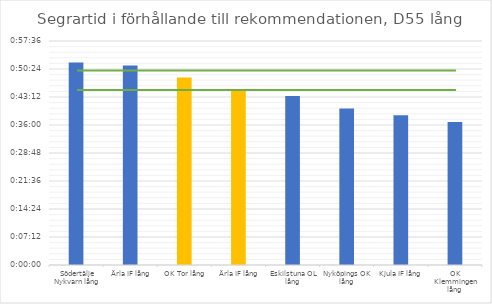
| Category | D55 tid |
|---|---|
| Södertälje Nykvarn lång | 0.036 |
| Ärla IF lång | 0.036 |
| OK Tor lång | 0.033 |
| Ärla IF lång | 0.031 |
| Eskilstuna OL lång | 0.03 |
| Nyköpings OK lång | 0.028 |
| Kjula IF lång | 0.027 |
| OK Klemmingen lång | 0.026 |